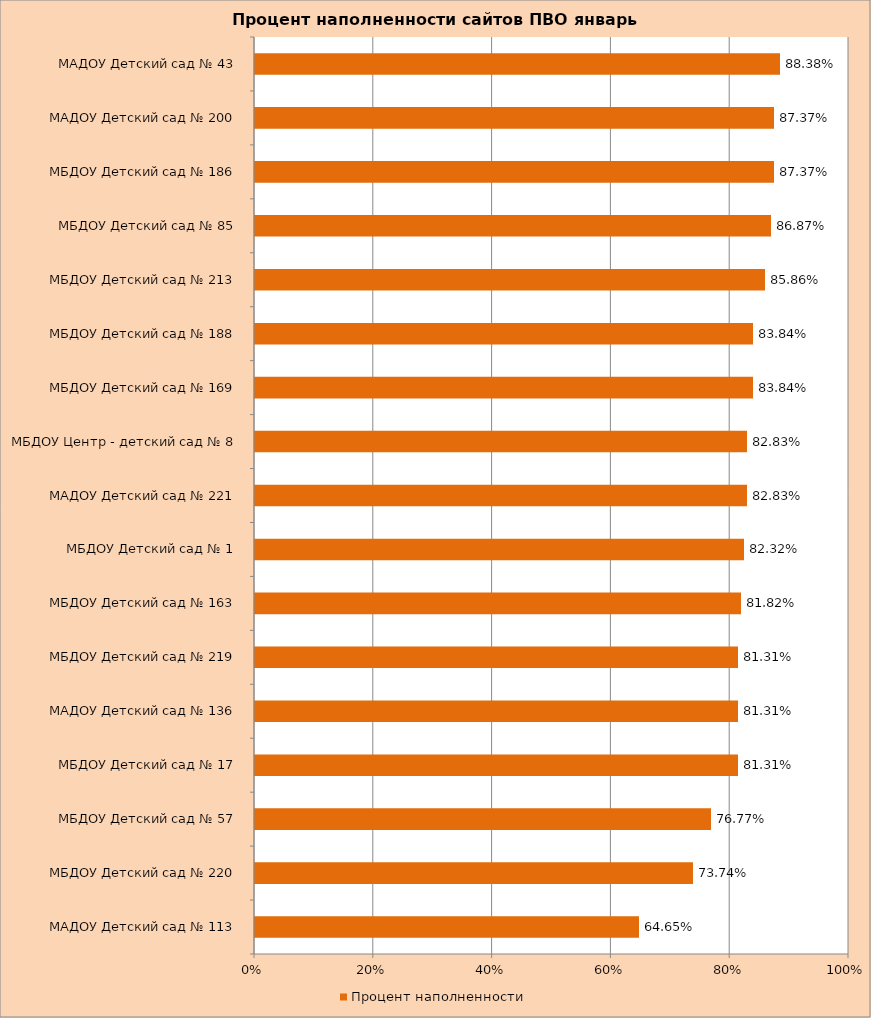
| Category | Процент наполненности |
|---|---|
| МАДОУ Детский сад № 113 | 0.646 |
| МБДОУ Детский сад № 220 | 0.737 |
| МБДОУ Детский сад № 57 | 0.768 |
| МБДОУ Детский сад № 17 | 0.813 |
| МАДОУ Детский сад № 136 | 0.813 |
| МБДОУ Детский сад № 219 | 0.813 |
| МБДОУ Детский сад № 163 | 0.818 |
| МБДОУ Детский сад № 1 | 0.823 |
| МАДОУ Детский сад № 221 | 0.828 |
| МБДОУ Центр - детский сад № 8 | 0.828 |
| МБДОУ Детский сад № 169 | 0.838 |
| МБДОУ Детский сад № 188 | 0.838 |
| МБДОУ Детский сад № 213 | 0.859 |
| МБДОУ Детский сад № 85 | 0.869 |
| МБДОУ Детский сад № 186 | 0.874 |
| МАДОУ Детский сад № 200 | 0.874 |
| МАДОУ Детский сад № 43 | 0.884 |